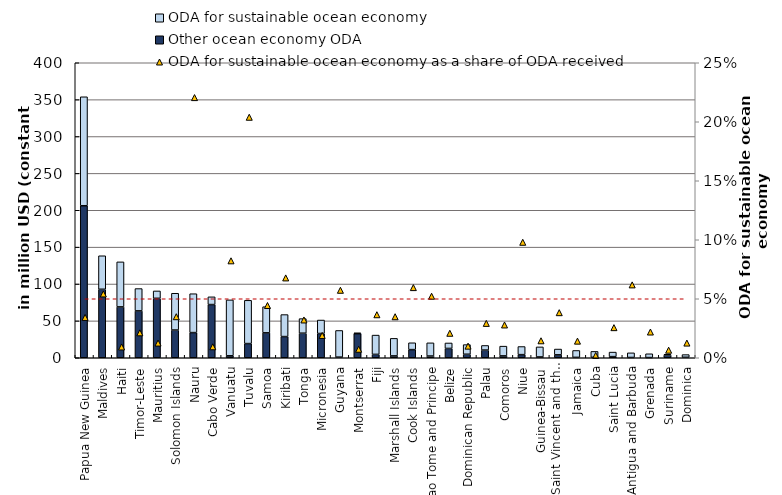
| Category | Other ocean economy ODA | ODA for sustainable ocean economy |
|---|---|---|
| Papua New Guinea | 206.104 | 147.753 |
| Maldives | 92.856 | 45.443 |
| Haiti | 68.947 | 61.062 |
| Timor-Leste | 63.551 | 30.266 |
| Mauritius | 80.58 | 10.016 |
| Solomon Islands | 37.605 | 49.868 |
| Nauru | 34.116 | 52.707 |
| Cabo Verde | 72.135 | 10.485 |
| Vanuatu | 2.645 | 75.817 |
| Tuvalu | 19.223 | 58.673 |
| Samoa | 33.777 | 35.447 |
| Kiribati | 28.716 | 29.84 |
| Tonga | 33.287 | 19.775 |
| Micronesia | 32.891 | 18.255 |
| Guyana | 0.865 | 36.147 |
| Montserrat | 32.638 | 1.189 |
| Fiji | 4.574 | 26.147 |
| Marshall Islands | 2.515 | 23.796 |
| Cook Islands | 11.029 | 9.285 |
| Sao Tome and Principe | 2.332 | 17.883 |
| Belize | 12.643 | 7.418 |
| Dominican Republic | 4.757 | 13.071 |
| Palau | 10.413 | 6.253 |
| Comoros | 2.542 | 13.218 |
| Niue | 4.235 | 10.99 |
| Guinea-Bissau | 1.097 | 13.613 |
| Saint Vincent and the Grenadines | 3.947 | 7.859 |
| Jamaica | 0.509 | 9.381 |
| Cuba | 0.548 | 8.063 |
| Saint Lucia | 1.544 | 6.131 |
| Antigua and Barbuda | 0.368 | 6.293 |
| Grenada | 0.258 | 5.135 |
| Suriname | 3.739 | 1.021 |
| Dominica | 0.627 | 3.674 |